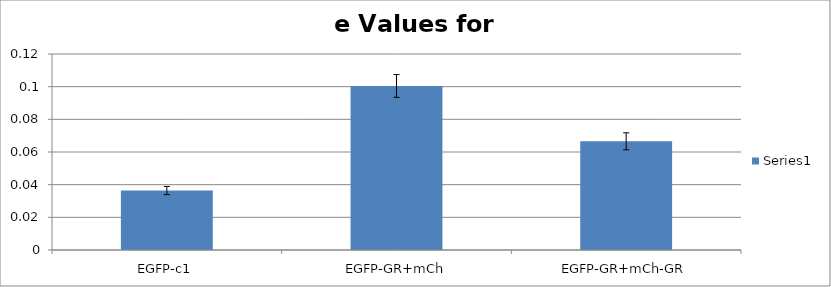
| Category | Series 0 |
|---|---|
| EGFP-c1 | 0.036 |
| EGFP-GR+mCh | 0.1 |
| EGFP-GR+mCh-GR | 0.067 |